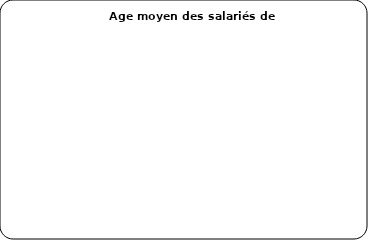
| Category | Effectif |
|---|---|
| moins de 45 | 0 |
| 45 et plus | 0 |